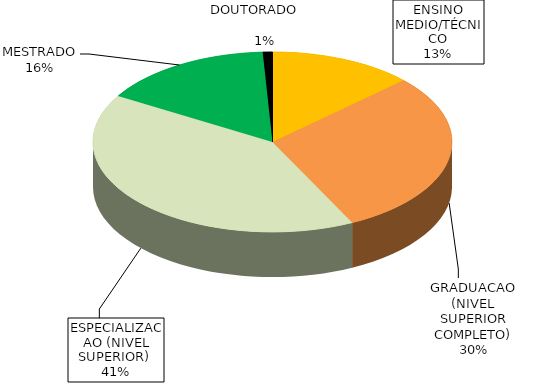
| Category | Series 0 |
|---|---|
| ENSINO MEDIO/TÉCNICO | 0.13 |
| GRADUACAO (NIVEL SUPERIOR COMPLETO) | 0.297 |
| ESPECIALIZACAO (NIVEL SUPERIOR)  | 0.408 |
| MESTRADO | 0.156 |
| DOUTORADO                             | 0.009 |